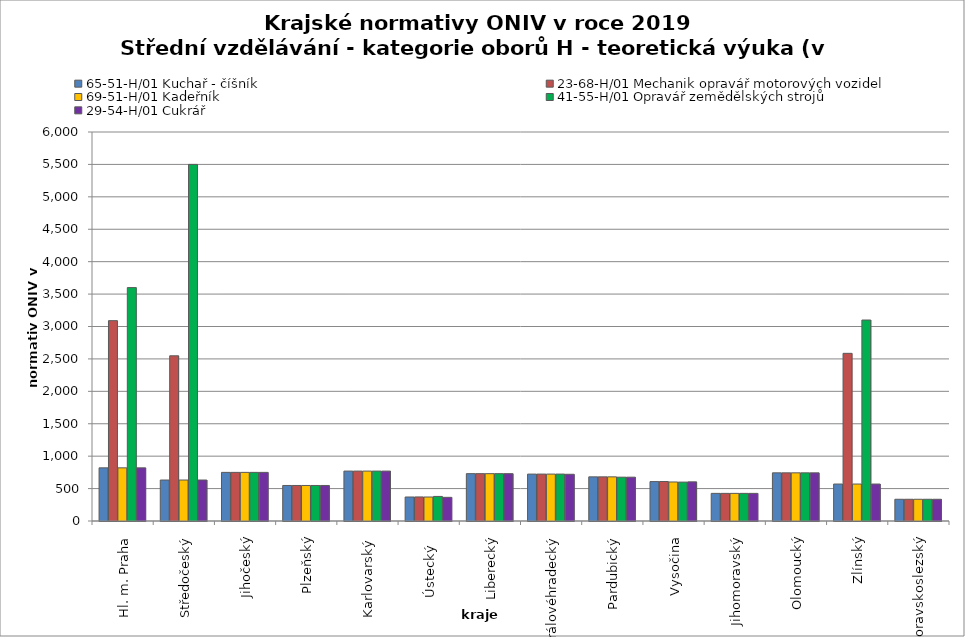
| Category | 65-51-H/01 Kuchař - číšník | 23-68-H/01 Mechanik opravář motorových vozidel | 69-51-H/01 Kadeřník | 41-55-H/01 Opravář zemědělských strojů | 29-54-H/01 Cukrář |
|---|---|---|---|---|---|
| Hl. m. Praha | 820 | 3090 | 820 | 3600 | 820 |
| Středočeský | 632 | 2548 | 632 | 5500 | 632 |
| Jihočeský | 750 | 750 | 750 | 750 | 750 |
| Plzeňský | 548 | 548 | 548 | 548 | 548 |
| Karlovarský  | 770 | 770 | 770 | 770 | 770 |
| Ústecký   | 370 | 371 | 370 | 379 | 365 |
| Liberecký | 730 | 730 | 730 | 730 | 730 |
| Královéhradecký | 723.4 | 723.7 | 723.7 | 723.7 | 720.7 |
| Pardubický | 681 | 681 | 681 | 676 | 676 |
| Vysočina | 608 | 609 | 602 | 600 | 604 |
| Jihomoravský | 426 | 426 | 426 | 426 | 426 |
| Olomoucký | 743 | 743 | 743 | 743 | 743 |
| Zlínský | 570 | 2586 | 570 | 3100 | 570 |
| Moravskoslezský | 335 | 335 | 335 | 335 | 335 |